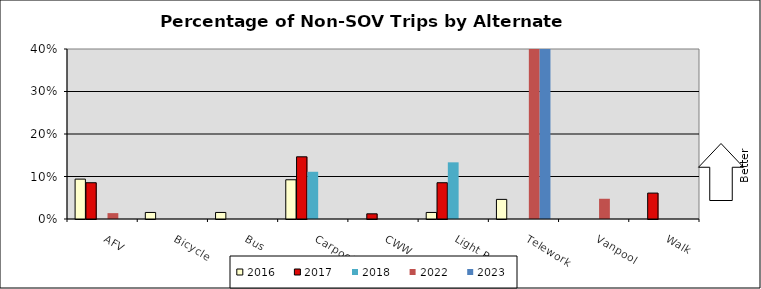
| Category | 2016 | 2017 | 2018 | 2022 | 2023 |
|---|---|---|---|---|---|
| AFV | 0.094 | 0.085 | 0 | 0.014 | 0 |
| Bicycle | 0.015 | 0 | 0 | 0 | 0 |
| Bus | 0.015 | 0 | 0 | 0 | 0 |
| Carpool | 0.092 | 0.146 | 0.111 | 0 | 0 |
| CWW | 0 | 0.012 | 0 | 0 | 0 |
| Light Rail | 0.015 | 0.085 | 0.133 | 0 | 0 |
| Telework | 0.046 | 0 | 0 | 0.429 | 0.478 |
| Vanpool | 0 | 0 | 0 | 0.048 | 0 |
| Walk | 0 | 0.061 | 0 | 0 | 0 |